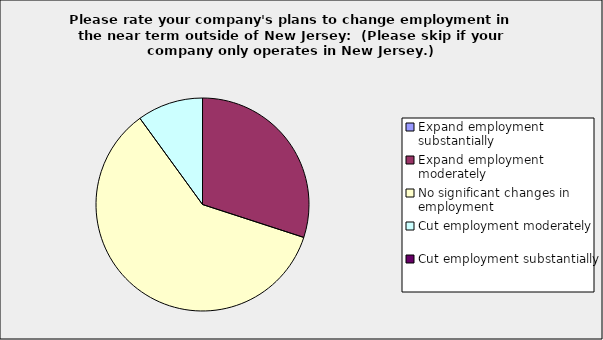
| Category | Series 0 |
|---|---|
| Expand employment substantially | 0 |
| Expand employment moderately | 0.3 |
| No significant changes in employment | 0.6 |
| Cut employment moderately | 0.1 |
| Cut employment substantially | 0 |